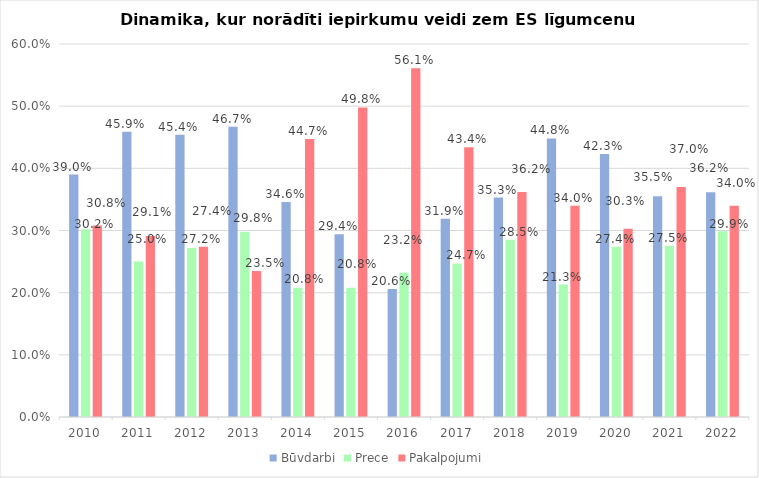
| Category | Būvdarbi | Prece | Pakalpojumi |
|---|---|---|---|
| 2010.0 | 0.39 | 0.302 | 0.308 |
| 2011.0 | 0.459 | 0.25 | 0.291 |
| 2012.0 | 0.454 | 0.272 | 0.274 |
| 2013.0 | 0.467 | 0.298 | 0.235 |
| 2014.0 | 0.346 | 0.208 | 0.447 |
| 2015.0 | 0.294 | 0.208 | 0.498 |
| 2016.0 | 0.206 | 0.232 | 0.561 |
| 2017.0 | 0.319 | 0.247 | 0.434 |
| 2018.0 | 0.353 | 0.285 | 0.362 |
| 2019.0 | 0.448 | 0.213 | 0.34 |
| 2020.0 | 0.423 | 0.274 | 0.303 |
| 2021.0 | 0.355 | 0.275 | 0.37 |
| 2022.0 | 0.362 | 0.299 | 0.34 |